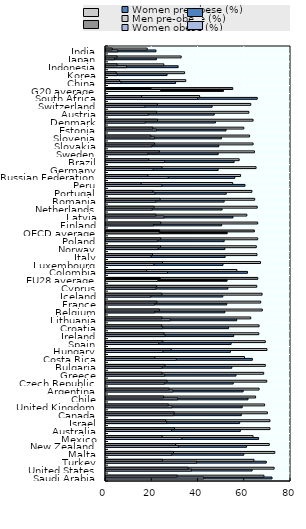
| Category | Women pre-obese (%) | Men pre-obese (%) |
|---|---|---|
| Saudi Arabia | 71.8 | 68.3 |
| United States | 63.2 | 72.7 |
| Turkey | 69.3 | 64 |
| Malta | 59.6 | 73 |
| New Zealand | 60.8 | 70.6 |
| Mexico | 66 | 63.6 |
| Australia | 58.1 | 70.9 |
| Israel | 57.8 | 70.9 |
| Canada | 58.5 | 69.8 |
| United Kingdom | 58.9 | 68.6 |
| Chile | 61.4 | 64.7 |
| Argentina | 59.3 | 66.2 |
| Czech Republic | 55 | 69.5 |
| Greece | 56.2 | 68.2 |
| Bulgaria | 54.4 | 68.9 |
| Costa Rica | 63.3 | 59.9 |
| Hungary | 53.8 | 69.6 |
| Spain | 54.1 | 68.9 |
| Ireland | 55.2 | 66.1 |
| Croatia | 53 | 66.2 |
| Lithuania | 56.5 | 62.6 |
| Belgium | 51.4 | 67.6 |
| France | 52.2 | 66.9 |
| Iceland | 50.5 | 67.5 |
| Cyprus | 52.7 | 65.2 |
| EU28 average | 52.361 | 65.646 |
| Colombia | 61.2 | 56.6 |
| Luxembourg | 50.6 | 66.8 |
| Italy | 51.5 | 65.3 |
| Norway | 51.4 | 65 |
| Poland | 51.1 | 65.6 |
| OECD average | 52.4 | 64.147 |
| Finland | 50 | 65.6 |
| Latvia | 54.9 | 60.9 |
| Netherlands | 50.2 | 65.4 |
| Romania | 51.1 | 64.3 |
| Portugal | 52 | 63.1 |
| Peru | 60.1 | 54.8 |
| Russian Federation | 55.7 | 58.2 |
| Germany | 48.5 | 64.9 |
| Brazil | 55.4 | 57.6 |
| Sweden | 48.5 | 64.2 |
| Slovakia | 48.8 | 63.6 |
| Slovenia | 49.9 | 62.1 |
| Estonia | 51.9 | 59.6 |
| Denmark | 47.3 | 63.6 |
| Austria | 46.8 | 61.8 |
| Switzerland | 45.9 | 62.6 |
| South Africa | 65.4 | 40.5 |
| G20 average | 50.784 | 54.805 |
| China | 30.1 | 34.5 |
| Korea | 26.4 | 34 |
| Indonesia | 31.2 | 25 |
| Japan | 21.8 | 32.5 |
| India | 21.6 | 17.8 |